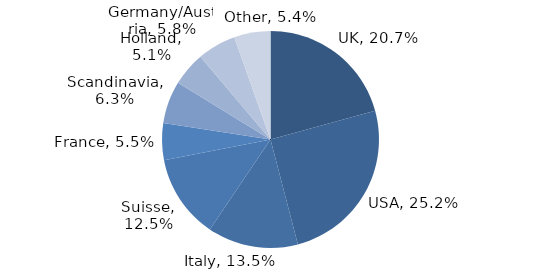
| Category | Investment Style |
|---|---|
| UK | 0.207 |
| USA | 0.252 |
| Italy | 0.135 |
| Suisse | 0.125 |
| France | 0.055 |
| Scandinavia | 0.063 |
| Holland | 0.051 |
| Germany/Austria | 0.058 |
| Other | 0.054 |